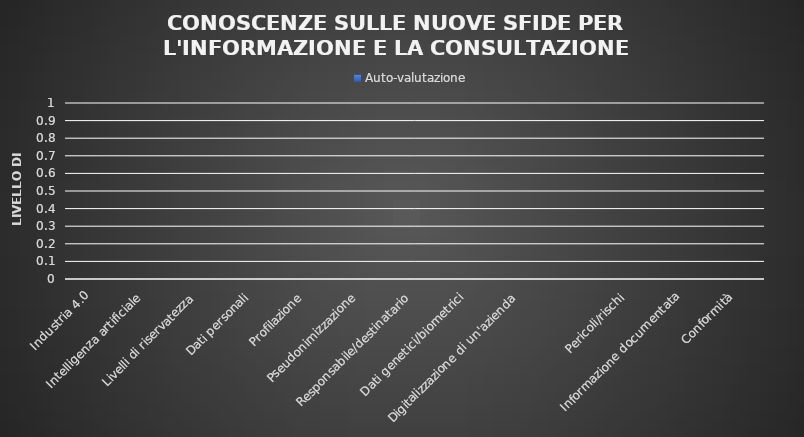
| Category | Auto-valutazione |
|---|---|
| Industria 4.0 | 0 |
| Intelligenza artificiale | 0 |
| Livelli di riservatezza | 0 |
| Dati personali | 0 |
| Profilazione | 0 |
| Pseudonimizzazione | 0 |
| Responsabile/destinatario | 0 |
| Dati genetici/biometrici | 0 |
| Digitalizzazione di un'azienda | 0 |
|  | 0 |
| Pericoli/rischi | 0 |
| Informazione documentata | 0 |
| Conformità | 0 |